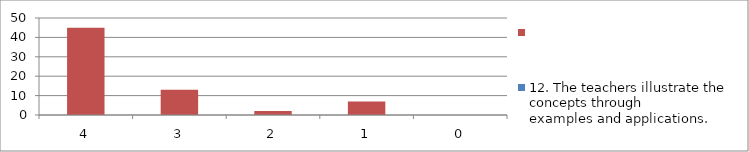
| Category | 12. The teachers illustrate the concepts through
examples and applications. | Series 1 |
|---|---|---|
| 4.0 | 0 | 45 |
| 3.0 | 0 | 13 |
| 2.0 | 0 | 2 |
| 1.0 | 0 | 7 |
| 0.0 | 0 | 0 |